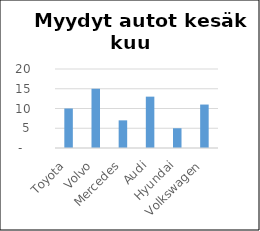
| Category | Series 0 |
|---|---|
| Toyota | 10 |
| Volvo | 15 |
| Mercedes | 7 |
| Audi | 13 |
| Hyundai | 5 |
| Volkswagen | 11 |